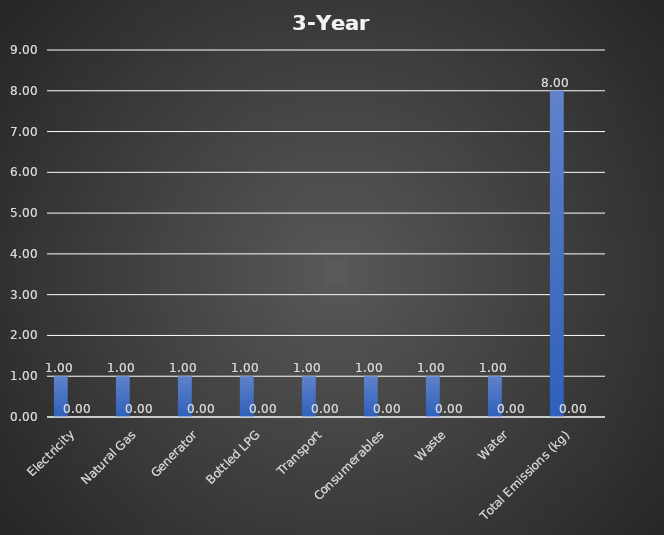
| Category | Series 0 | Series 1 | Series 2 |
|---|---|---|---|
| Electricity | 1 | 0 |  |
| Natural Gas | 1 | 0 |  |
| Generator | 1 | 0 |  |
| Bottled LPG | 1 | 0 |  |
| Transport | 1 | 0 |  |
| Consumerables | 1 | 0 |  |
| Waste | 1 | 0 |  |
| Water | 1 | 0 |  |
| Total Emissions (kg) | 8 | 0 |  |